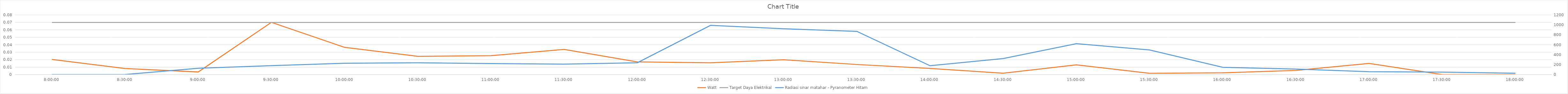
| Category | Watt | Target Daya Elektrikal |
|---|---|---|
| 2019-04-13 08:00:00 | 0.02 | 0.07 |
| 304976.3541666666 | 0.008 | 0.07 |
| 566384.3750000001 | 0.003 | 0.07 |
| 827792.3958333336 | 0.07 | 0.07 |
| 1089200.416666667 | 0.037 | 0.07 |
| 1350608.4375000005 | 0.024 | 0.07 |
| 1612016.458333334 | 0.025 | 0.07 |
| 1873424.4791666674 | 0.034 | 0.07 |
| 2134832.500000001 | 0.017 | 0.07 |
| 2396240.520833333 | 0.016 | 0.07 |
| 2657648.541666665 | 0.02 | 0.07 |
| 2919056.562499997 | 0.014 | 0.07 |
| 1089200.5833333337 | 0.008 | 0.07 |
| 1350608.6041666672 | 0.002 | 0.07 |
| 1612016.6250000007 | 0.013 | 0.07 |
| 1873424.6458333342 | 0.002 | 0.07 |
| 2134832.6666666674 | 0.002 | 0.07 |
| 2396240.6874999995 | 0.006 | 0.07 |
| 2657648.7083333316 | 0.015 | 0.07 |
| 2919056.7291666637 | 0 | 0.07 |
| 1089200.7500000005 | 0 | 0.07 |